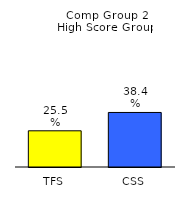
| Category | Series 0 |
|---|---|
| TFS | 0.255 |
| CSS | 0.384 |